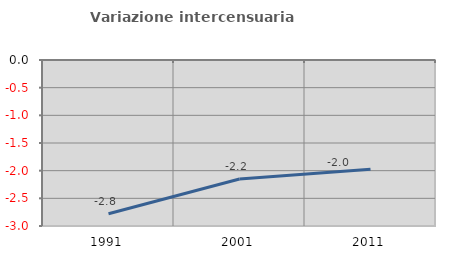
| Category | Variazione intercensuaria annua |
|---|---|
| 1991.0 | -2.78 |
| 2001.0 | -2.151 |
| 2011.0 | -1.976 |